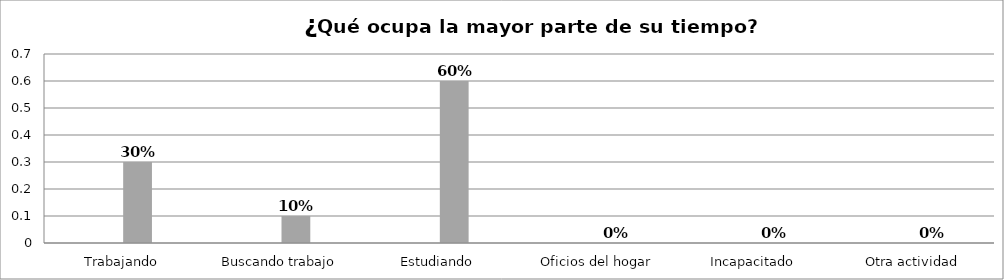
| Category | Series 0 | Series 1 | Series 2 | Series 3 |
|---|---|---|---|---|
| Trabajando |  |  | 0.3 |  |
| Buscando trabajo |  |  | 0.1 |  |
| Estudiando |  |  | 0.6 |  |
| Oficios del hogar |  |  | 0 |  |
| Incapacitado  |  |  | 0 |  |
| Otra actividad |  |  | 0 |  |